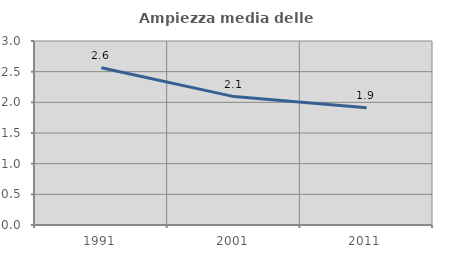
| Category | Ampiezza media delle famiglie |
|---|---|
| 1991.0 | 2.563 |
| 2001.0 | 2.093 |
| 2011.0 | 1.912 |